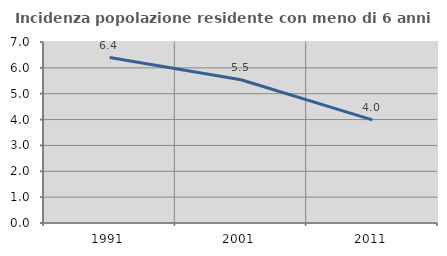
| Category | Incidenza popolazione residente con meno di 6 anni |
|---|---|
| 1991.0 | 6.399 |
| 2001.0 | 5.54 |
| 2011.0 | 3.987 |